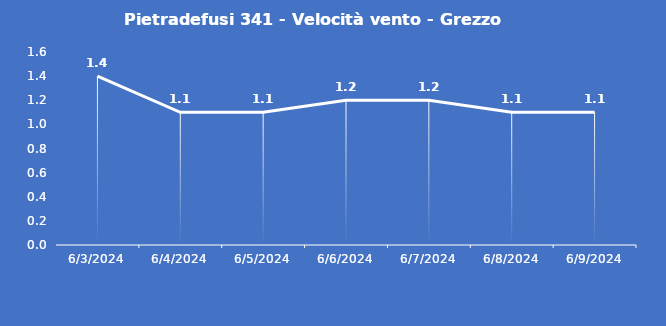
| Category | Pietradefusi 341 - Velocità vento - Grezzo (m/s) |
|---|---|
| 6/3/24 | 1.4 |
| 6/4/24 | 1.1 |
| 6/5/24 | 1.1 |
| 6/6/24 | 1.2 |
| 6/7/24 | 1.2 |
| 6/8/24 | 1.1 |
| 6/9/24 | 1.1 |